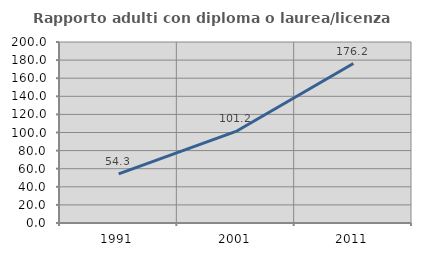
| Category | Rapporto adulti con diploma o laurea/licenza media  |
|---|---|
| 1991.0 | 54.321 |
| 2001.0 | 101.184 |
| 2011.0 | 176.199 |